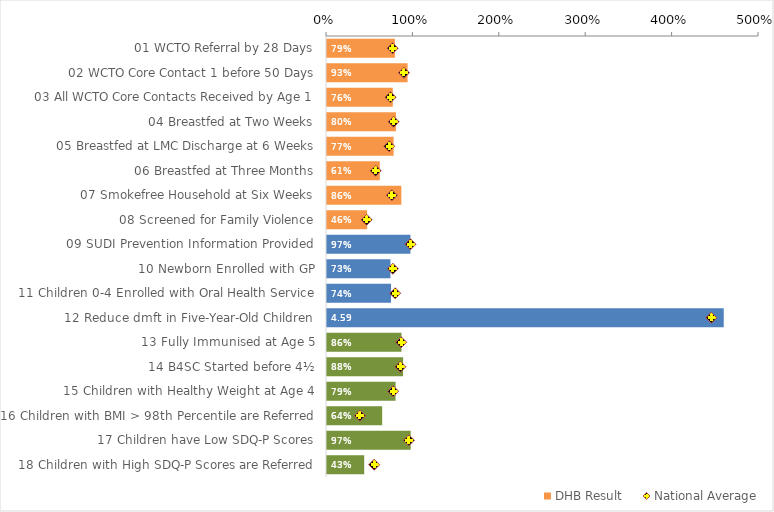
| Category | DHB Result |
|---|---|
| 01 WCTO Referral by 28 Days | 0.786 |
| 02 WCTO Core Contact 1 before 50 Days | 0.933 |
| 03 All WCTO Core Contacts Received by Age 1 | 0.762 |
| 04 Breastfed at Two Weeks | 0.798 |
| 05 Breastfed at LMC Discharge at 6 Weeks | 0.771 |
| 06 Breastfed at Three Months | 0.611 |
| 07 Smokefree Household at Six Weeks | 0.86 |
| 08 Screened for Family Violence | 0.464 |
| 09 SUDI Prevention Information Provided | 0.966 |
| 10 Newborn Enrolled with GP | 0.734 |
| 11 Children 0-4 Enrolled with Oral Health Service | 0.741 |
| 12 Reduce dmft in Five-Year-Old Children | 4.592 |
| 13 Fully Immunised at Age 5 | 0.862 |
| 14 B4SC Started before 4½ | 0.881 |
| 15 Children with Healthy Weight at Age 4 | 0.794 |
| 16 Children with BMI > 98th Percentile are Referred | 0.638 |
| 17 Children have Low SDQ-P Scores | 0.968 |
| 18 Children with High SDQ-P Scores are Referred | 0.431 |